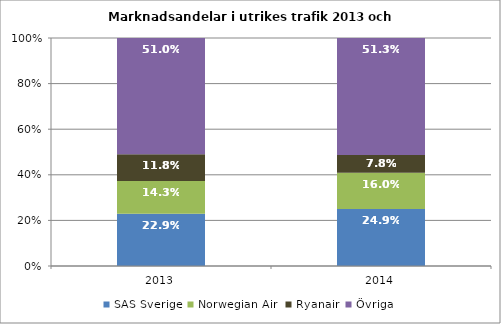
| Category | SAS Sverige | Norwegian Air  | Ryanair | Övriga |
|---|---|---|---|---|
| 2013.0 | 0.229 | 0.143 | 0.118 | 0.51 |
| 2014.0 | 0.249 | 0.16 | 0.078 | 0.513 |